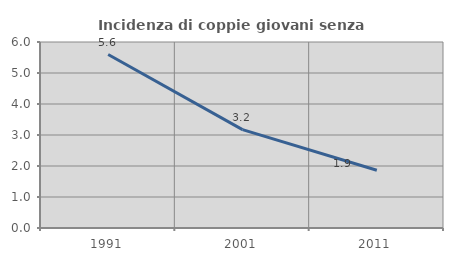
| Category | Incidenza di coppie giovani senza figli |
|---|---|
| 1991.0 | 5.596 |
| 2001.0 | 3.175 |
| 2011.0 | 1.862 |